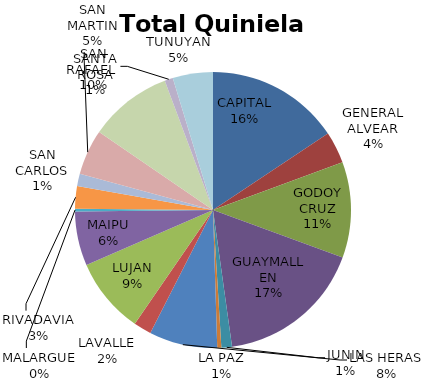
| Category | Total Quiniela Beneficio |
|---|---|
| CAPITAL | 3328991.03 |
| GENERAL ALVEAR | 788727.46 |
| GODOY CRUZ | 2383167.08 |
| GUAYMALLEN | 3659570.07 |
| JUNIN | 263704.18 |
| LA PAZ | 101096.33 |
| LAS HERAS | 1700043.83 |
| LAVALLE | 442829.69 |
| LUJAN | 1890831.25 |
| MAIPU | 1350545.08 |
| MALARGUE | 66773.28 |
| RIVADAVIA | 558950.77 |
| SAN CARLOS | 305105.45 |
| SAN MARTIN | 1135576.68 |
| SAN RAFAEL  | 2074823.12 |
| SANTA ROSA | 207036.75 |
| TUNUYAN | 1001027.92 |